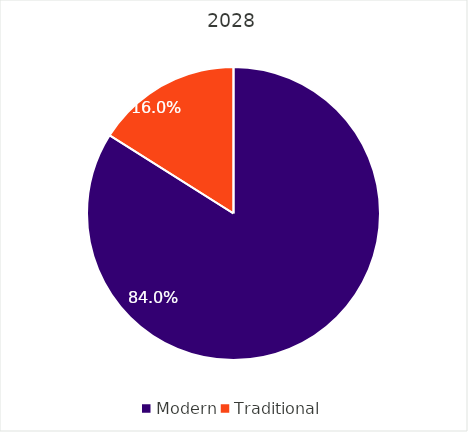
| Category | Series 0 |
|---|---|
| Modern | 0.84 |
| Traditional | 0.16 |